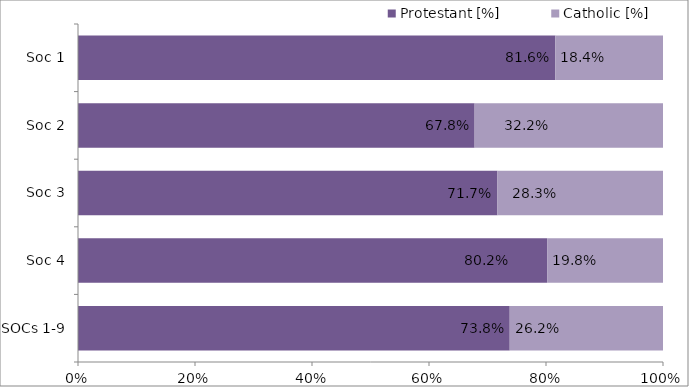
| Category | Protestant | Catholic |
|---|---|---|
| SOCs 1-9 | 0.738 | 0.262 |
| Soc 4 | 0.802 | 0.198 |
| Soc 3 | 0.717 | 0.283 |
| Soc 2 | 0.678 | 0.322 |
| Soc 1 | 0.816 | 0.184 |